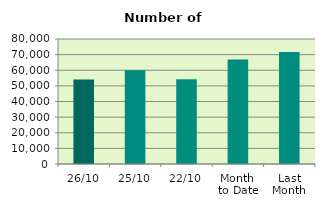
| Category | Series 0 |
|---|---|
| 26/10 | 54034 |
| 25/10 | 59976 |
| 22/10 | 54196 |
| Month 
to Date | 66883.889 |
| Last
Month | 71692 |